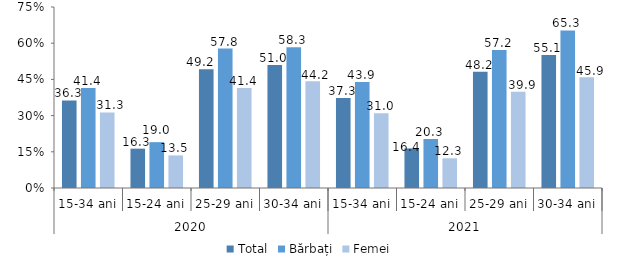
| Category | Total | Bărbați | Femei |
|---|---|---|---|
| 0 | 36.3 | 41.4 | 31.3 |
| 1 | 16.3 | 19 | 13.5 |
| 2 | 49.2 | 57.8 | 41.4 |
| 3 | 51 | 58.3 | 44.2 |
| 4 | 37.3 | 43.9 | 31 |
| 5 | 16.4 | 20.3 | 12.3 |
| 6 | 48.2 | 57.2 | 39.9 |
| 7 | 55.1 | 65.3 | 45.9 |